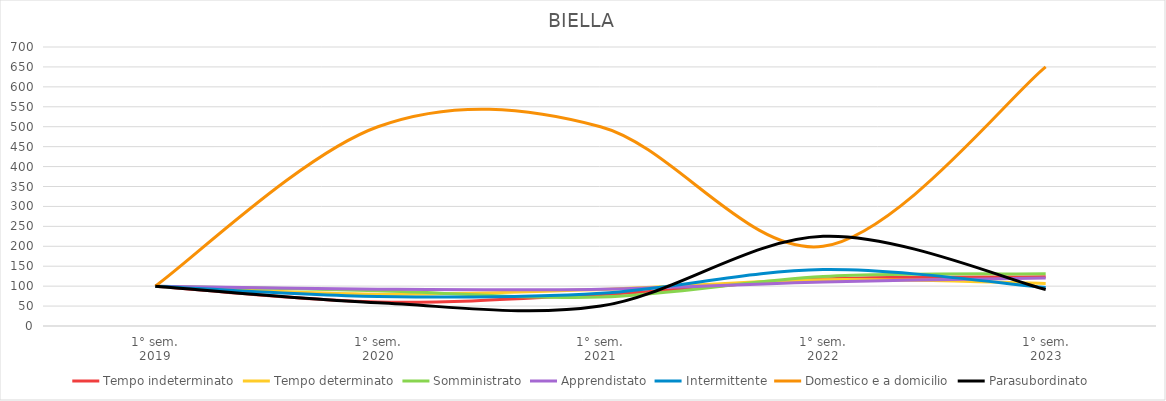
| Category | Tempo indeterminato | Tempo determinato | Somministrato | Apprendistato | Intermittente | Domestico e a domicilio | Parasubordinato |
|---|---|---|---|---|---|---|---|
| 1° sem.
2019 | 100 | 100 | 100 | 100 | 100 | 100 | 100 |
| 1° sem.
2020 | 60.227 | 79.863 | 88.732 | 92.308 | 74.157 | 500 | 58.333 |
| 1° sem.
2021 | 78.977 | 91.762 | 72.535 | 92.308 | 82.022 | 500 | 50 |
| 1° sem.
2022 | 118.182 | 116.247 | 123.944 | 110.256 | 141.573 | 200 | 225 |
| 1° sem.
2023 | 123.295 | 106.865 | 130.986 | 120.513 | 96.629 | 650 | 91.667 |